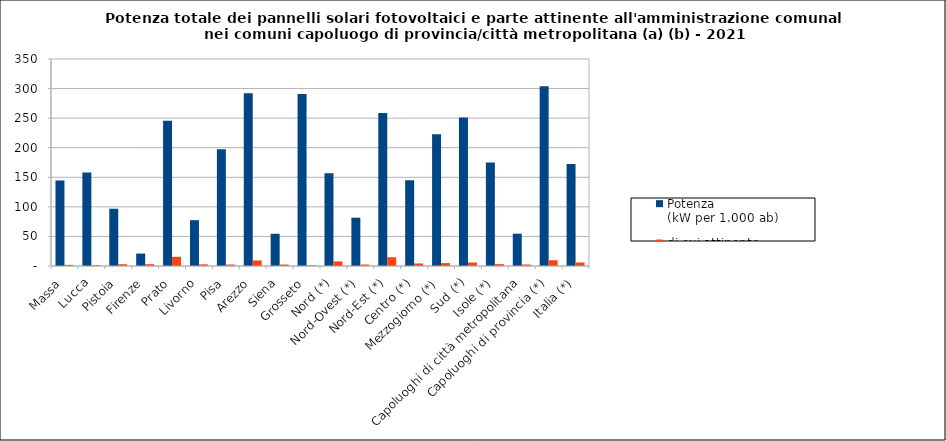
| Category | Potenza
(kW per 1.000 ab) | di cui attinente all'amministrazione comunale (b) |
|---|---|---|
| Massa | 144.461 | 1.95 |
| Lucca | 158.15 | 1.389 |
| Pistoia | 96.803 | 2.991 |
| Firenze | 21.024 | 3.07 |
| Prato | 245.588 | 15.546 |
| Livorno | 77.481 | 2.769 |
| Pisa | 197.305 | 2.444 |
| Arezzo | 292.136 | 9.365 |
| Siena | 54.446 | 2.496 |
| Grosseto | 290.632 | 1.071 |
| Nord (*) | 156.74 | 7.732 |
| Nord-Ovest (*) | 81.697 | 2.485 |
| Nord-Est (*) | 258.574 | 14.853 |
| Centro (*) | 144.803 | 4.293 |
| Mezzogiorno (*) | 222.784 | 4.884 |
| Sud (*) | 251.287 | 5.925 |
| Isole (*) | 175.037 | 3.141 |
| Capoluoghi di città metropolitana | 54.62 | 2.562 |
| Capoluoghi di provincia (*) | 303.918 | 9.703 |
| Italia (*) | 172.626 | 5.942 |